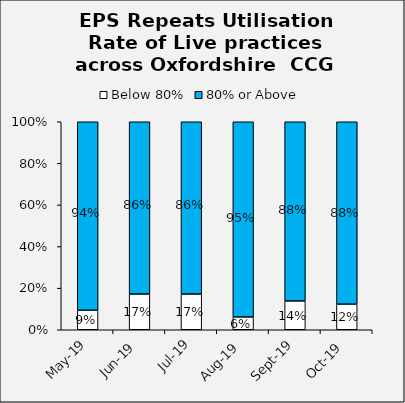
| Category | Below 80% | 80% or Above |
|---|---|---|
| 2019-05-01 | 0.094 | 0.938 |
| 2019-06-01 | 0.172 | 0.859 |
| 2019-07-01 | 0.172 | 0.859 |
| 2019-08-01 | 0.062 | 0.954 |
| 2019-09-01 | 0.138 | 0.877 |
| 2019-10-01 | 0.123 | 0.877 |